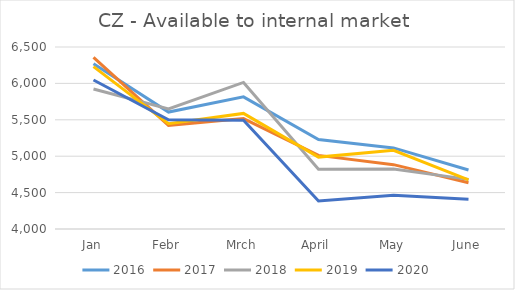
| Category | 2016 | 2017 | 2018 | 2019 | 2020 |
|---|---|---|---|---|---|
| Jan | 6269 | 6358.719 | 5922.149 | 6230.192 | 6046.681 |
| Febr | 5606 | 5423.97 | 5649.188 | 5445.047 | 5499.881 |
| Mrch | 5815 | 5517.405 | 6013.26 | 5587.586 | 5494.388 |
| April | 5228 | 5011.044 | 4821.882 | 4987.519 | 4385.032 |
| May | 5114 | 4883.905 | 4823.044 | 5081.291 | 4464.476 |
| June | 4811 | 4634.41 | 4681.789 | 4674.029 | 4409.074 |